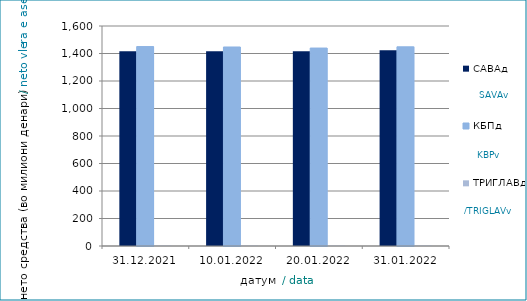
| Category | САВАд | КБПд | ТРИГЛАВд |
|---|---|---|---|
| 2021-12-31 | 1416.139 | 1450.404 | 3.061 |
| 2022-01-10 | 1415.951 | 1447.365 | 3.132 |
| 2022-01-20 | 1416.216 | 1439.644 | 3.134 |
| 2022-01-31 | 1423.267 | 1448.623 | 3.487 |